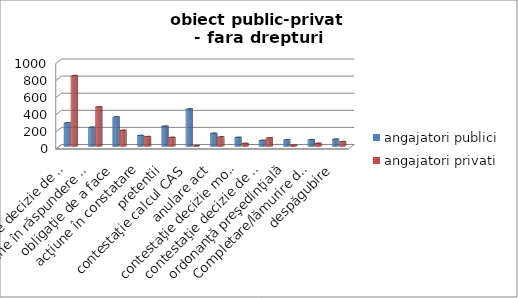
| Category | angajatori publici | angajatori privati |
|---|---|---|
| contestaţie decizie de concediere | 271 | 823 |
| acţiune în răspundere patrimonială | 220 | 458 |
| obligaţie de a face | 341 | 184 |
| acţiune în constatare | 123 | 110 |
| pretentii | 232 | 100 |
| contestaţie calcul CAS | 433 | 2 |
| anulare act | 149 | 106 |
| contestaţie decizie modificare unilaterală contract de muncă | 101 | 30 |
| contestaţie decizie de sancţionare | 66 | 95 |
| ordonanţă preşedinţială | 72 | 11 |
| Completare/lămurire dispozitiv  | 73 | 31 |
| despăgubire  | 80 | 50 |